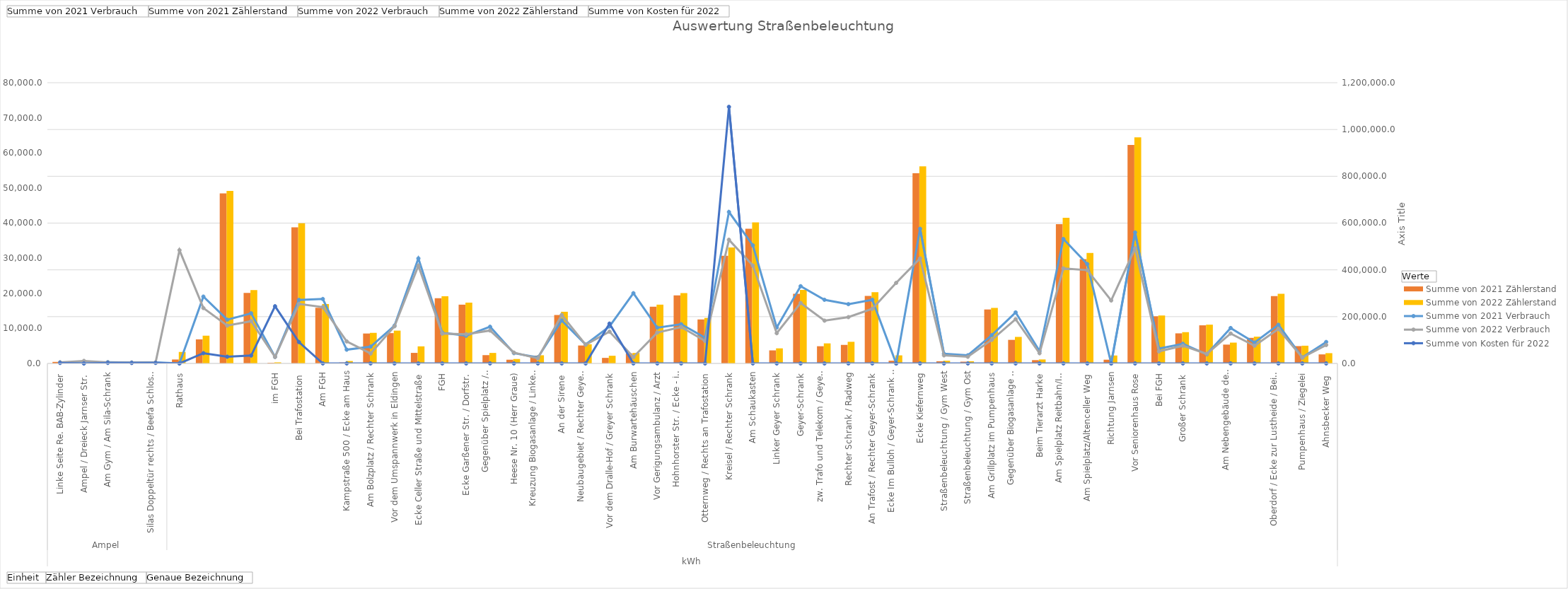
| Category | Summe von 2021 Zählerstand | Summe von 2022 Zählerstand |
|---|---|---|
| 0 | 6613 | 6926 |
| 1 | 0 | 726 |
| 2 | 1295 | 1593 |
| 3 | 1460 | 1708 |
| 4 | 1422 | 1699 |
| 5 | 16825 | 49102 |
| 6 | 102868 | 118654 |
| 7 | 726590 | 737371 |
| 8 | 301345 | 313403 |
| 9 | 2810 | 4651 |
| 10 | 582091 | 599050 |
| 11 | 237883 | 253936 |
| 12 | 4098 | 10369 |
| 13 | 127937 | 130772 |
| 14 | 129660 | 140240 |
| 15 | 45181 | 73028 |
| 16 | 278634 | 287127 |
| 17 | 251303 | 259619 |
| 18 | 35524 | 44911 |
| 19 | 15900 | 18981 |
| 20 | 33492 | 34936 |
| 21 | 207064 | 220898 |
| 22 | 76708 | 82040 |
| 23 | 23749 | 32810 |
| 24 | 43034 | 44857 |
| 25 | 242521 | 251318 |
| 26 | 290559 | 300924 |
| 27 | 188079 | 194475 |
| 28 | 460138 | 495381 |
| 29 | 575470 | 603363 |
| 30 | 55854 | 64476 |
| 31 | 297398 | 314629 |
| 32 | 73572 | 85769 |
| 33 | 79319 | 92513 |
| 34 | 288972 | 304532 |
| 35 | 11608 | 34571 |
| 36 | 812851 | 842777 |
| 37 | 9304 | 11605 |
| 38 | 7522 | 9421 |
| 39 | 230710 | 237429 |
| 40 | 100824 | 113431 |
| 41 | 14150 | 17065 |
| 42 | 595305 | 622386 |
| 43 | 445946 | 472525 |
| 44 | 16023 | 33967 |
| 45 | 933813 | 966567 |
| 46 | 201549 | 204966 |
| 47 | 128646 | 133700 |
| 48 | 162980 | 165710 |
| 49 | 80524 | 89048 |
| 50 | 109342 | 114387 |
| 51 | 287585 | 297387 |
| 52 | 74116 | 75785 |
| 53 | 38717 | 43973 |